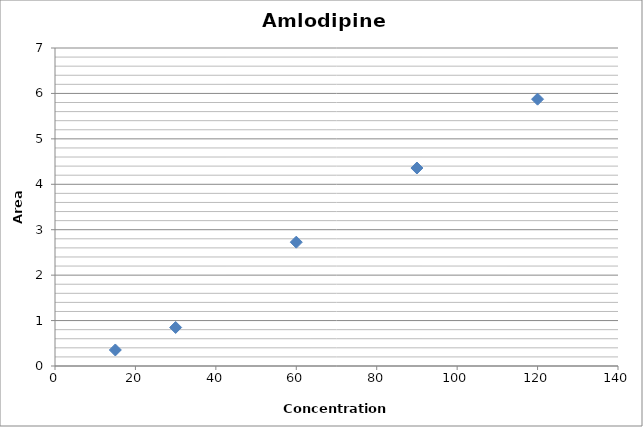
| Category | Series 0 |
|---|---|
| 15.0 | 0.353 |
| 30.0 | 0.848 |
| 60.0 | 2.726 |
| 90.0 | 4.358 |
| 120.0 | 5.874 |